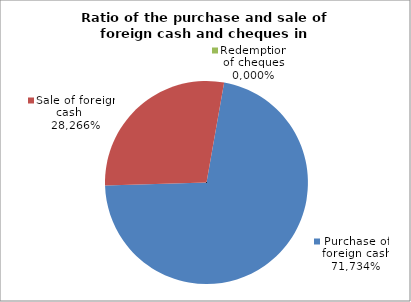
| Category | Purchase of foreign cash |
|---|---|
| 0 | 0.717 |
| 1 | 0.283 |
| 2 | 0 |